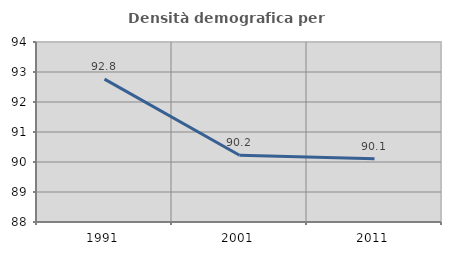
| Category | Densità demografica |
|---|---|
| 1991.0 | 92.764 |
| 2001.0 | 90.226 |
| 2011.0 | 90.107 |